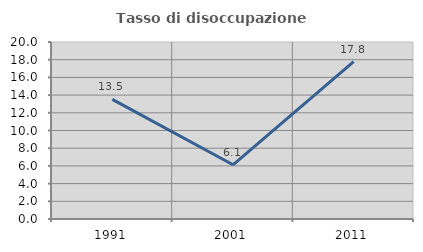
| Category | Tasso di disoccupazione giovanile  |
|---|---|
| 1991.0 | 13.521 |
| 2001.0 | 6.126 |
| 2011.0 | 17.786 |